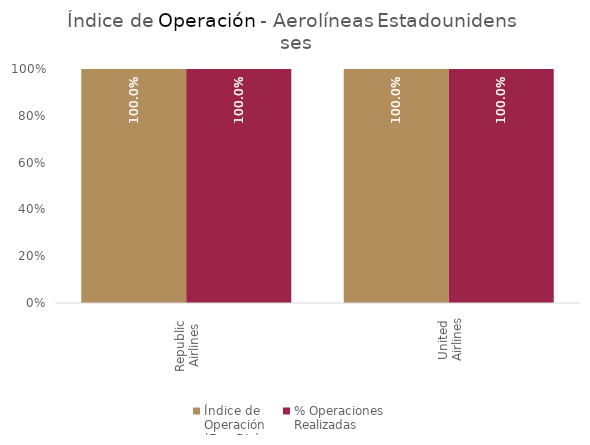
| Category | Índice de 
Operación
(Ene-Dic) | % Operaciones
Realizadas |
|---|---|---|
| Republic 
Airlines | 1 | 1 |
| United 
Airlines | 1 | 1 |